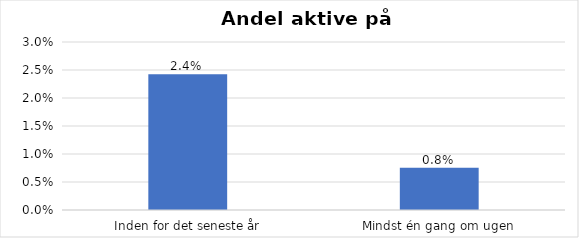
| Category | % |
|---|---|
| Inden for det seneste år | 0.024 |
| Mindst én gang om ugen | 0.008 |